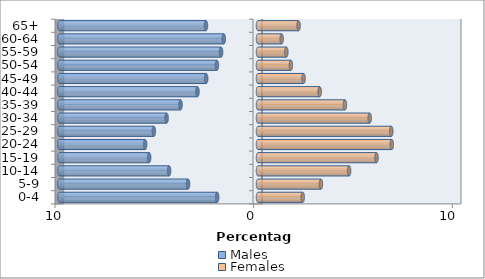
| Category | Males | Females |
|---|---|---|
| 0-4 | -2.055 | 2.252 |
| 5-9 | -3.521 | 3.167 |
| 10-14 | -4.473 | 4.586 |
| 15-19 | -5.479 | 5.966 |
| 20-24 | -5.681 | 6.735 |
| 25-29 | -5.242 | 6.709 |
| 30-34 | -4.599 | 5.624 |
| 35-39 | -3.899 | 4.375 |
| 40-44 | -3.047 | 3.106 |
| 45-49 | -2.608 | 2.293 |
| 50-54 | -2.067 | 1.655 |
| 55-59 | -1.859 | 1.426 |
| 60-64 | -1.721 | 1.192 |
| 65+ | -2.619 | 2.043 |